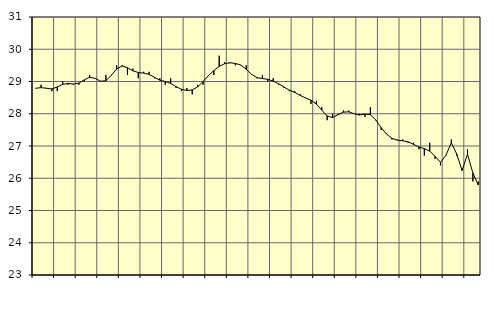
| Category | Piggar | Series 1 |
|---|---|---|
| nan | 28.8 | 28.79 |
| 1.0 | 28.9 | 28.81 |
| 1.0 | 28.8 | 28.79 |
| 1.0 | 28.7 | 28.77 |
| nan | 28.7 | 28.83 |
| 2.0 | 29 | 28.91 |
| 2.0 | 28.9 | 28.94 |
| 2.0 | 28.9 | 28.92 |
| nan | 28.9 | 28.95 |
| 3.0 | 29 | 29.05 |
| 3.0 | 29.2 | 29.13 |
| 3.0 | 29.1 | 29.1 |
| nan | 29 | 29.01 |
| 4.0 | 29.2 | 29.02 |
| 4.0 | 29.2 | 29.19 |
| 4.0 | 29.5 | 29.39 |
| nan | 29.5 | 29.48 |
| 5.0 | 29.2 | 29.43 |
| 5.0 | 29.4 | 29.33 |
| 5.0 | 29.1 | 29.28 |
| nan | 29.3 | 29.26 |
| 6.0 | 29.3 | 29.22 |
| 6.0 | 29.1 | 29.13 |
| 6.0 | 29.1 | 29.04 |
| nan | 28.9 | 29 |
| 7.0 | 29.1 | 28.94 |
| 7.0 | 28.8 | 28.84 |
| 7.0 | 28.7 | 28.76 |
| nan | 28.8 | 28.72 |
| 8.0 | 28.6 | 28.74 |
| 8.0 | 28.9 | 28.83 |
| 8.0 | 28.9 | 29 |
| nan | 29.2 | 29.18 |
| 9.0 | 29.2 | 29.34 |
| 9.0 | 29.8 | 29.47 |
| 9.0 | 29.6 | 29.55 |
| nan | 29.6 | 29.58 |
| 10.0 | 29.5 | 29.56 |
| 10.0 | 29.5 | 29.51 |
| 10.0 | 29.5 | 29.38 |
| nan | 29.2 | 29.22 |
| 11.0 | 29.1 | 29.12 |
| 11.0 | 29.2 | 29.09 |
| 11.0 | 29 | 29.07 |
| nan | 29.1 | 29.01 |
| 12.0 | 28.9 | 28.93 |
| 12.0 | 28.8 | 28.83 |
| 12.0 | 28.7 | 28.73 |
| nan | 28.7 | 28.66 |
| 13.0 | 28.6 | 28.57 |
| 13.0 | 28.5 | 28.49 |
| 13.0 | 28.3 | 28.42 |
| nan | 28.4 | 28.3 |
| 14.0 | 28.2 | 28.11 |
| 14.0 | 27.8 | 27.93 |
| 14.0 | 28 | 27.88 |
| nan | 28 | 27.97 |
| 15.0 | 28.1 | 28.05 |
| 15.0 | 28.1 | 28.06 |
| 15.0 | 28 | 28 |
| nan | 28 | 27.96 |
| 16.0 | 27.9 | 27.99 |
| 16.0 | 28.2 | 27.97 |
| 16.0 | 27.8 | 27.81 |
| nan | 27.5 | 27.57 |
| 17.0 | 27.4 | 27.37 |
| 17.0 | 27.2 | 27.24 |
| 17.0 | 27.2 | 27.18 |
| nan | 27.2 | 27.16 |
| 18.0 | 27.1 | 27.13 |
| 18.0 | 27.1 | 27.05 |
| 18.0 | 26.9 | 26.97 |
| nan | 26.7 | 26.92 |
| 19.0 | 27.1 | 26.84 |
| 19.0 | 26.6 | 26.68 |
| 19.0 | 26.4 | 26.49 |
| nan | 26.7 | 26.71 |
| 20.0 | 27.2 | 27.1 |
| 20.0 | 26.7 | 26.75 |
| 20.0 | 26.3 | 26.24 |
| nan | 26.9 | 26.75 |
| 21.0 | 25.9 | 26.16 |
| 21.0 | 25.9 | 25.79 |